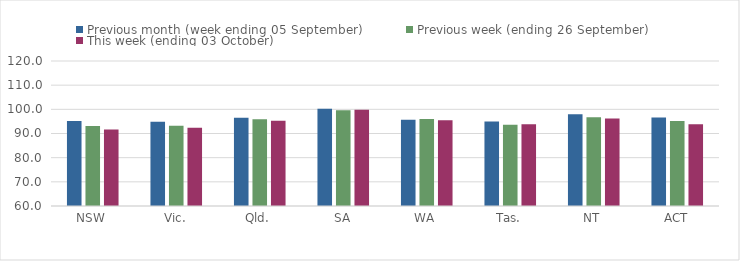
| Category | Previous month (week ending 05 September) | Previous week (ending 26 September) | This week (ending 03 October) |
|---|---|---|---|
| NSW | 95.21 | 93.15 | 91.7 |
| Vic. | 94.89 | 93.16 | 92.37 |
| Qld. | 96.52 | 95.85 | 95.31 |
| SA | 100.24 | 99.64 | 99.82 |
| WA | 95.65 | 95.96 | 95.53 |
| Tas. | 95 | 93.59 | 93.81 |
| NT | 97.98 | 96.75 | 96.25 |
| ACT | 96.57 | 95.13 | 93.82 |